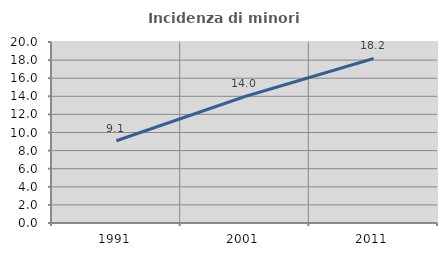
| Category | Incidenza di minori stranieri |
|---|---|
| 1991.0 | 9.091 |
| 2001.0 | 13.978 |
| 2011.0 | 18.182 |